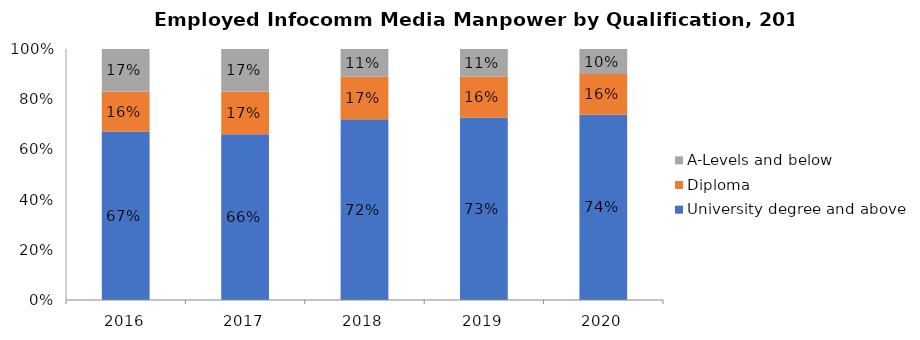
| Category | University degree and above | Diploma | A-Levels and below |
|---|---|---|---|
| 2016.0 | 0.67 | 0.158 | 0.17 |
| 2017.0 | 0.66 | 0.17 | 0.17 |
| 2018.0 | 0.72 | 0.169 | 0.11 |
| 2019.0 | 0.73 | 0.164 | 0.11 |
| 2020.0 | 0.74 | 0.162 | 0.1 |